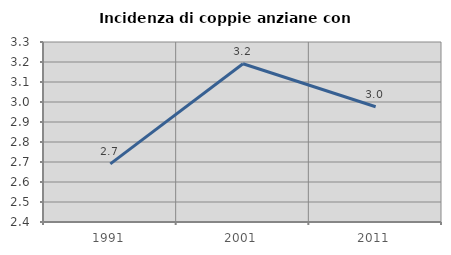
| Category | Incidenza di coppie anziane con figli |
|---|---|
| 1991.0 | 2.691 |
| 2001.0 | 3.191 |
| 2011.0 | 2.976 |